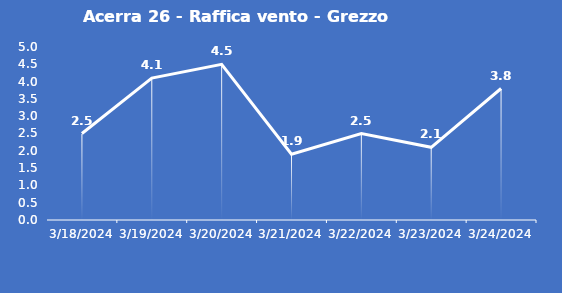
| Category | Acerra 26 - Raffica vento - Grezzo (m/s) |
|---|---|
| 3/18/24 | 2.5 |
| 3/19/24 | 4.1 |
| 3/20/24 | 4.5 |
| 3/21/24 | 1.9 |
| 3/22/24 | 2.5 |
| 3/23/24 | 2.1 |
| 3/24/24 | 3.8 |